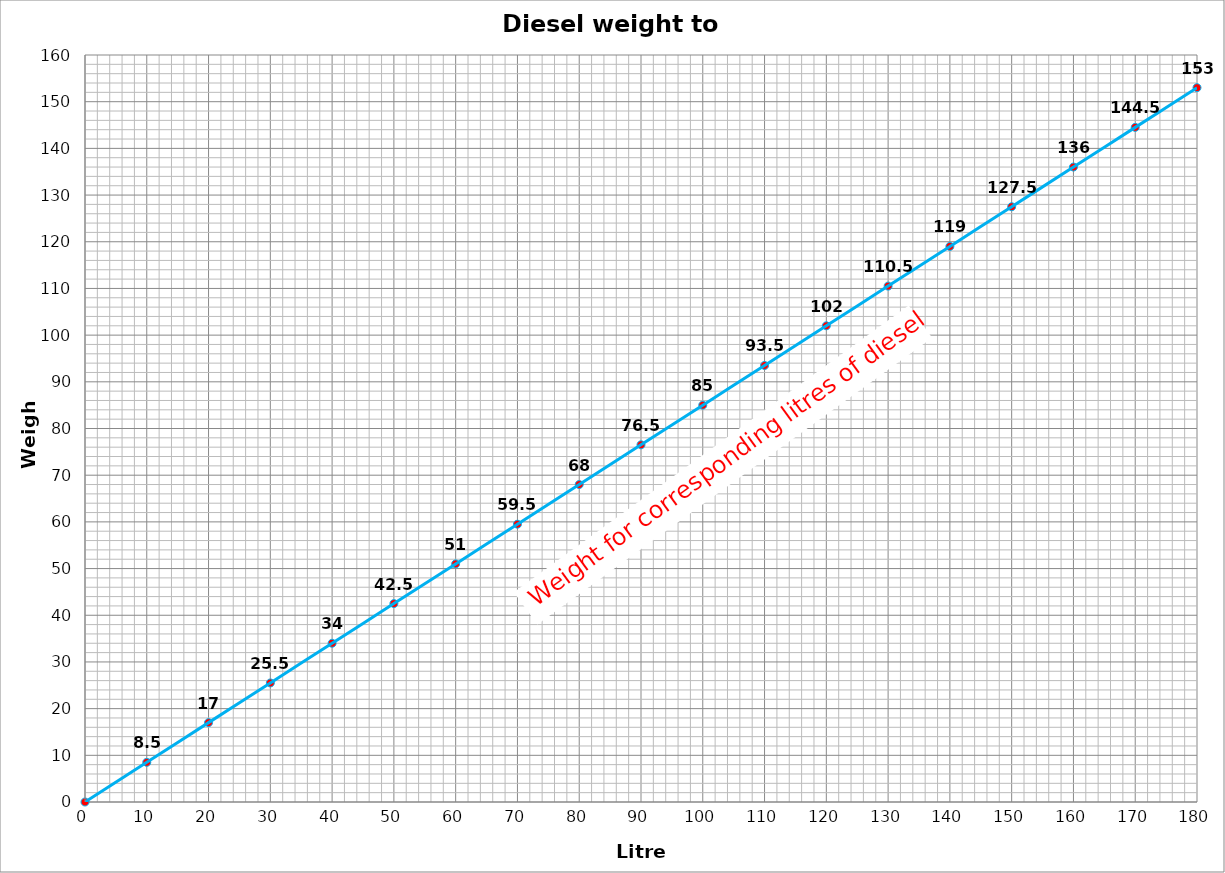
| Category | Series 0 |
|---|---|
| 0.0 | 0 |
| 10.0 | 8.5 |
| 20.0 | 17 |
| 30.0 | 25.5 |
| 40.0 | 34 |
| 50.0 | 42.5 |
| 60.0 | 51 |
| 70.0 | 59.5 |
| 80.0 | 68 |
| 90.0 | 76.5 |
| 100.0 | 85 |
| 110.0 | 93.5 |
| 120.0 | 102 |
| 130.0 | 110.5 |
| 140.0 | 119 |
| 150.0 | 127.5 |
| 160.0 | 136 |
| 170.0 | 144.5 |
| 180.0 | 153 |